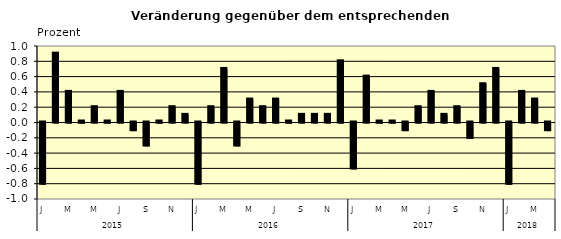
| Category | Series 0 |
|---|---|
| 0 | -0.8 |
| 1 | 0.9 |
| 2 | 0.4 |
| 3 | 0.01 |
| 4 | 0.2 |
| 5 | 0.01 |
| 6 | 0.4 |
| 7 | -0.1 |
| 8 | -0.3 |
| 9 | 0.01 |
| 10 | 0.2 |
| 11 | 0.1 |
| 12 | -0.8 |
| 13 | 0.2 |
| 14 | 0.7 |
| 15 | -0.3 |
| 16 | 0.3 |
| 17 | 0.2 |
| 18 | 0.3 |
| 19 | 0.01 |
| 20 | 0.1 |
| 21 | 0.1 |
| 22 | 0.1 |
| 23 | 0.8 |
| 24 | -0.6 |
| 25 | 0.6 |
| 26 | 0.01 |
| 27 | 0.01 |
| 28 | -0.1 |
| 29 | 0.2 |
| 30 | 0.4 |
| 31 | 0.1 |
| 32 | 0.2 |
| 33 | -0.2 |
| 34 | 0.5 |
| 35 | 0.7 |
| 36 | -0.8 |
| 37 | 0.4 |
| 38 | 0.3 |
| 39 | -0.1 |